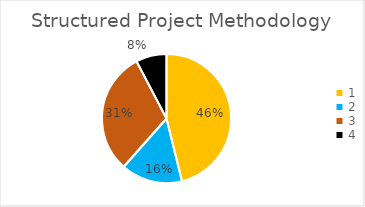
| Category | Series 0 |
|---|---|
| 0 | 0.462 |
| 1 | 0.154 |
| 2 | 0.308 |
| 3 | 0.077 |